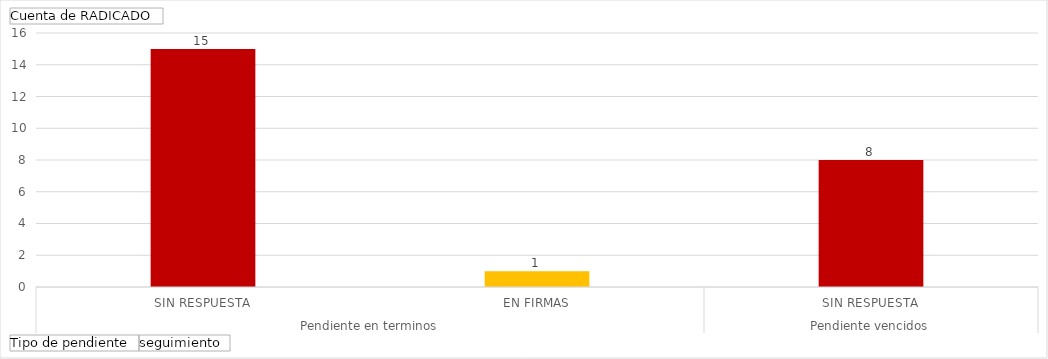
| Category | Total |
|---|---|
| 0 | 15 |
| 1 | 1 |
| 2 | 8 |